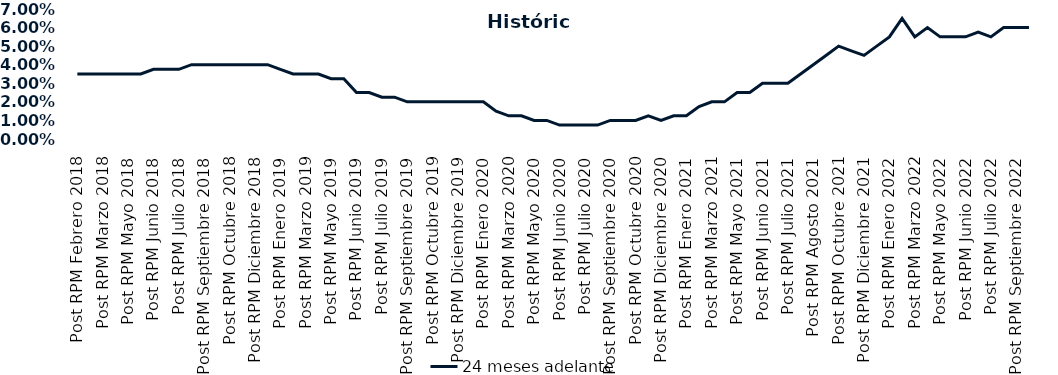
| Category | 24 meses adelante  |
|---|---|
| Post RPM Febrero 2018 | 0.035 |
| Pre RPM Marzo 2018 | 0.035 |
| Post RPM Marzo 2018 | 0.035 |
| Pre RPM Mayo 2018 | 0.035 |
| Post RPM Mayo 2018 | 0.035 |
| Pre RPM Junio 2018 | 0.035 |
| Post RPM Junio 2018 | 0.038 |
| Pre RPM Julio 2018 | 0.038 |
| Post RPM Julio 2018 | 0.038 |
| Pre RPM Septiembre 2018 | 0.04 |
| Post RPM Septiembre 2018 | 0.04 |
| Pre RPM Octubre 2018 | 0.04 |
| Post RPM Octubre 2018 | 0.04 |
| Pre RPM Diciembre 2018 | 0.04 |
| Post RPM Diciembre 2018 | 0.04 |
| Pre RPM Enero 2019 | 0.04 |
| Post RPM Enero 2019 | 0.038 |
| Pre RPM Marzo 2019 | 0.035 |
| Post RPM Marzo 2019 | 0.035 |
| Pre RPM Mayo 2019 | 0.035 |
| Post RPM Mayo 2019 | 0.032 |
| Pre RPM Junio 2019 | 0.032 |
| Post RPM Junio 2019 | 0.025 |
| Pre RPM Julio 2019 | 0.025 |
| Post RPM Julio 2019 | 0.022 |
| Pre RPM Septiembre 2019 | 0.022 |
| Post RPM Septiembre 2019 | 0.02 |
| Pre RPM Octubre 2019 | 0.02 |
| Post RPM Octubre 2019 | 0.02 |
| Pre RPM Diciembre 2019 | 0.02 |
| Post RPM Diciembre 2019 | 0.02 |
| Pre RPM Enero 2020 | 0.02 |
| Post RPM Enero 2020 | 0.02 |
| Pre RPM Marzo 2020 | 0.015 |
| Post RPM Marzo 2020 | 0.012 |
| Pre RPM Mayo 2020 | 0.012 |
| Post RPM Mayo 2020 | 0.01 |
| Pre RPM Junio 2020 | 0.01 |
| Post RPM Junio 2020 | 0.008 |
| Pre RPM Julio 2020 | 0.008 |
| Post RPM Julio 2020 | 0.008 |
| Pre RPM Septiembre 2020 | 0.008 |
| Post RPM Septiembre 2020 | 0.01 |
| Pre RPM Octubre 2020 | 0.01 |
| Post RPM Octubre 2020 | 0.01 |
| Pre RPM Diciembre 2020 | 0.012 |
| Post RPM Diciembre 2020 | 0.01 |
| Pre RPM Enero 2021 | 0.012 |
| Post RPM Enero 2021 | 0.012 |
| Pre RPM Marzo 2021 | 0.018 |
| Post RPM Marzo 2021 | 0.02 |
| Pre RPM Mayo 2021 | 0.02 |
| Post RPM Mayo 2021 | 0.025 |
| Pre RPM Junio 2021 | 0.025 |
| Post RPM Junio 2021 | 0.03 |
| Pre RPM Julio 2021 | 0.03 |
| Post RPM Julio 2021 | 0.03 |
| Pre RPM Agosto 2021 | 0.035 |
| Post RPM Agosto 2021 | 0.04 |
| Pre RPM Octubre 2021 | 0.045 |
| Post RPM Octubre 2021 | 0.05 |
| Pre RPM Diciembre 2021 | 0.048 |
| Post RPM Diciembre 2021 | 0.045 |
| Pre RPM Enero 2022 | 0.05 |
| Post RPM Enero 2022 | 0.055 |
| Pre RPM Marzo 2022 | 0.065 |
| Post RPM Marzo 2022 | 0.055 |
| Pre RPM Mayo 2022 | 0.06 |
| Post RPM Mayo 2022 | 0.055 |
| Pre RPM Junio 2022 | 0.055 |
| Post RPM Junio 2022 | 0.055 |
| Pre RPM Julio 2022 | 0.058 |
| Post RPM Julio 2022 | 0.055 |
| Pre RPM Septiembre 2022 | 0.06 |
| Post RPM Septiembre 2022 | 0.06 |
| Pre RPM Octubre 2022 | 0.06 |